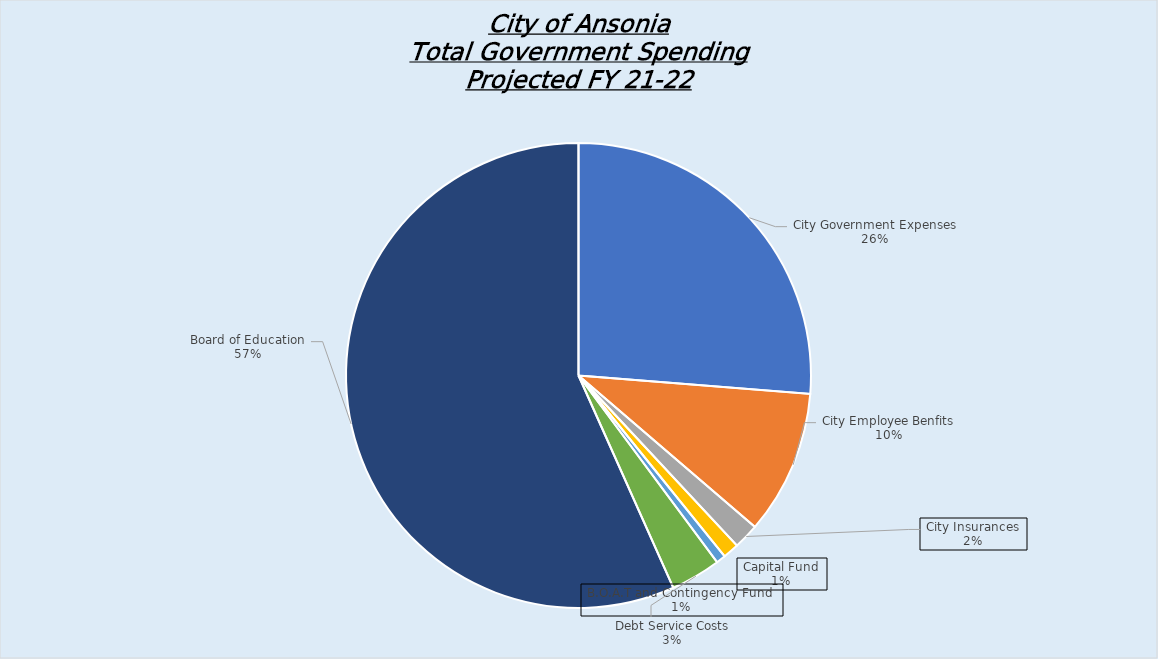
| Category | Series 0 |
|---|---|
|  City Government Expenses  | 15540357.95 |
|  City Employee Benfits  | 5934016.751 |
|  City Insurances  | 1050029 |
|  Capital Fund  | 662356 |
|  B.O.A.T and Contingency Fund   | 389000 |
|  Debt Service Costs  | 2058083 |
|  Board of Education  | 33547129.18 |